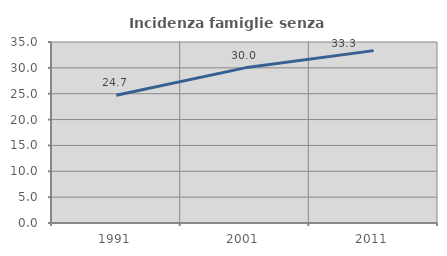
| Category | Incidenza famiglie senza nuclei |
|---|---|
| 1991.0 | 24.706 |
| 2001.0 | 30 |
| 2011.0 | 33.333 |